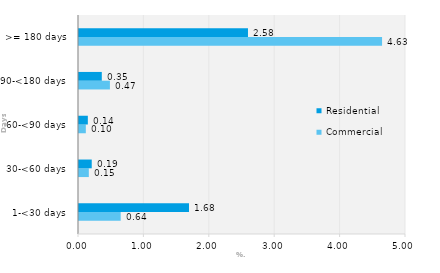
| Category | Commercial | Residential |
|---|---|---|
| 1-<30 days | 0.637 | 1.682 |
| 30-<60 days | 0.15 | 0.195 |
| 60-<90 days | 0.104 | 0.135 |
| 90-<180 days | 0.473 | 0.349 |
| >= 180 days | 4.634 | 2.584 |